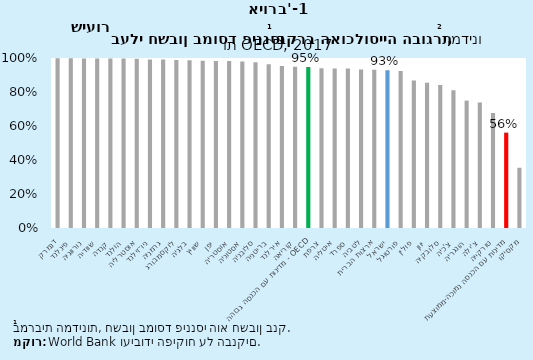
| Category | Financial institution account (% age 15+)  |
|---|---|
| דנמרק | 0.999 |
| פינלנד | 0.998 |
| נורווגיה | 0.997 |
| שוודיה | 0.997 |
| קנדה | 0.997 |
| הולנד | 0.996 |
| אוסטרליה | 0.995 |
| ניו־זילנד | 0.992 |
| גרמניה | 0.991 |
| לוקסמבורג | 0.988 |
| בלגיה | 0.986 |
| שוויץ | 0.984 |
| יפן | 0.982 |
| אוסטריה | 0.982 |
| אסטוניה | 0.98 |
| סלובניה | 0.975 |
| בריטניה | 0.964 |
| אירלנד | 0.953 |
| קוריאה | 0.949 |
| מדינות עם הכנסה גבוהה - OECD | 0.947 |
| צרפת | 0.94 |
| איטליה | 0.938 |
| ספרד | 0.938 |
| לטביה | 0.932 |
| ארצות הברית | 0.931 |
| ישראל | 0.928 |
| פורטוגל | 0.923 |
| פולין | 0.867 |
| יוון | 0.855 |
| סלובקיה | 0.842 |
| צ'כיה | 0.81 |
| הונגריה | 0.749 |
| צ'ילה | 0.738 |
| טורקייה | 0.677 |
| מדינות עם הכנסה נמוכה-ממוצעת | 0.561 |
| מקסיקו | 0.354 |